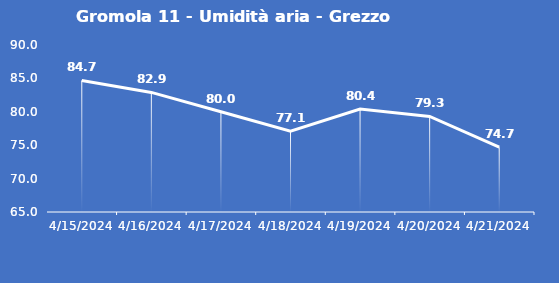
| Category | Gromola 11 - Umidità aria - Grezzo (%) |
|---|---|
| 4/15/24 | 84.7 |
| 4/16/24 | 82.9 |
| 4/17/24 | 80 |
| 4/18/24 | 77.1 |
| 4/19/24 | 80.4 |
| 4/20/24 | 79.3 |
| 4/21/24 | 74.7 |